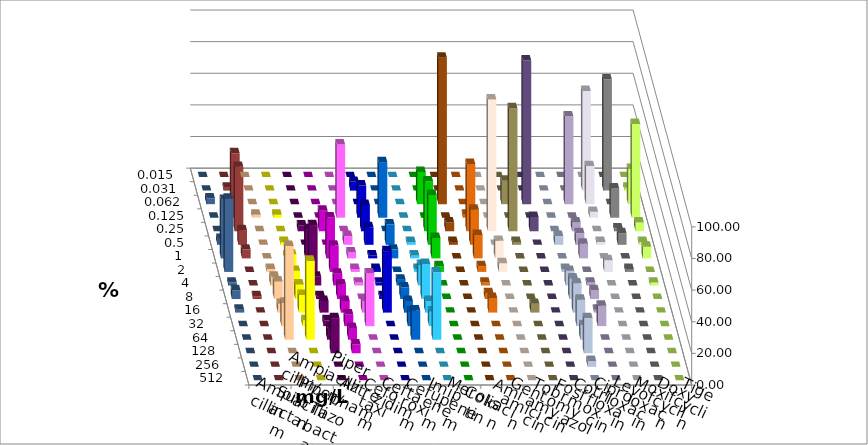
| Category | Ampicillin | Ampicillin/ Sulbactam | Piperacillin | Piperacillin/ Tazobactam | Aztreonam | Cefotaxim | Ceftazidim | Cefuroxim | Imipenem | Meropenem | Colistin | Amikacin | Gentamicin | Tobramycin | Fosfomycin | Cotrimoxazol | Ciprofloxacin | Levofloxacin | Moxifloxacin | Doxycyclin | Tigecyclin |
|---|---|---|---|---|---|---|---|---|---|---|---|---|---|---|---|---|---|---|---|---|---|
| 0.015 | 0 | 0 | 0 | 0 | 0 | 0 | 0 | 0 | 0 | 0 | 0 | 0 | 0 | 0 | 0 | 0 | 0 | 0 | 0 | 0 | 0 |
| 0.031 | 0 | 0 | 0 | 0 | 0 | 5.556 | 0 | 0 | 0 | 0 | 0 | 0 | 0 | 0 | 0 | 0 | 62.963 | 70.37 | 1.852 | 0 | 1.852 |
| 0.062 | 0 | 0 | 0 | 0 | 0 | 0 | 0 | 0 | 20.37 | 92.593 | 0 | 0 | 14.815 | 90.909 | 0 | 55.556 | 24.074 | 0 | 22.222 | 3.704 | 0 |
| 0.125 | 1.852 | 1.852 | 0 | 0 | 46.296 | 20.37 | 35.185 | 0 | 0 | 0 | 1.852 | 0 | 0 | 0 | 0 | 0 | 3.704 | 18.519 | 59.259 | 0 | 40.741 |
| 0.25 | 0 | 0 | 3.704 | 12.963 | 0 | 16.667 | 0 | 0 | 31.481 | 5.556 | 42.593 | 83.333 | 77.778 | 9.091 | 0 | 5.556 | 0 | 1.852 | 5.556 | 0 | 40.741 |
| 0.5 | 0 | 1.852 | 0 | 0 | 5.556 | 11.111 | 12.963 | 1.852 | 31.481 | 1.852 | 22.222 | 0 | 1.852 | 0 | 5.556 | 7.407 | 1.852 | 7.407 | 1.852 | 3.704 | 9.259 |
| 1.0 | 0 | 1.852 | 18.519 | 25.926 | 3.704 | 1.852 | 5.556 | 1.852 | 12.963 | 0 | 14.815 | 11.111 | 0 | 0 | 0 | 9.259 | 0 | 0 | 7.407 | 37.037 | 5.556 |
| 2.0 | 1.852 | 11.111 | 29.63 | 16.667 | 1.852 | 1.852 | 0 | 1.852 | 3.704 | 0 | 3.704 | 5.556 | 0 | 0 | 1.852 | 0 | 7.407 | 1.852 | 0 | 46.296 | 0 |
| 4.0 | 5.556 | 9.259 | 5.556 | 7.407 | 1.852 | 1.852 | 3.704 | 12.963 | 0 | 0 | 1.852 | 0 | 0 | 0 | 9.259 | 1.852 | 0 | 0 | 1.852 | 1.852 | 0 |
| 8.0 | 11.111 | 9.259 | 1.852 | 9.259 | 0 | 1.852 | 7.407 | 22.222 | 0 | 0 | 3.704 | 0 | 0 | 0 | 12.963 | 5.556 | 0 | 0 | 0 | 5.556 | 1.852 |
| 16.0 | 5.556 | 11.111 | 7.407 | 7.407 | 7.407 | 38.889 | 7.407 | 7.407 | 0 | 0 | 9.259 | 0 | 5.556 | 0 | 18.519 | 1.852 | 0 | 0 | 0 | 1.852 | 0 |
| 32.0 | 14.815 | 3.704 | 3.704 | 7.407 | 33.333 | 0 | 9.259 | 9.259 | 0 | 0 | 0 | 0 | 0 | 0 | 16.667 | 12.963 | 0 | 0 | 0 | 0 | 0 |
| 64.0 | 59.259 | 50 | 7.407 | 7.407 | 0 | 0 | 18.519 | 42.593 | 0 | 0 | 0 | 0 | 0 | 0 | 9.259 | 0 | 0 | 0 | 0 | 0 | 0 |
| 128.0 | 0 | 0 | 22.222 | 5.556 | 0 | 0 | 0 | 0 | 0 | 0 | 0 | 0 | 0 | 0 | 22.222 | 0 | 0 | 0 | 0 | 0 | 0 |
| 256.0 | 0 | 0 | 0 | 0 | 0 | 0 | 0 | 0 | 0 | 0 | 0 | 0 | 0 | 0 | 3.704 | 0 | 0 | 0 | 0 | 0 | 0 |
| 512.0 | 0 | 0 | 0 | 0 | 0 | 0 | 0 | 0 | 0 | 0 | 0 | 0 | 0 | 0 | 0 | 0 | 0 | 0 | 0 | 0 | 0 |